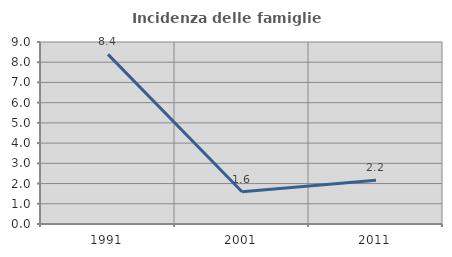
| Category | Incidenza delle famiglie numerose |
|---|---|
| 1991.0 | 8.387 |
| 2001.0 | 1.596 |
| 2011.0 | 2.162 |